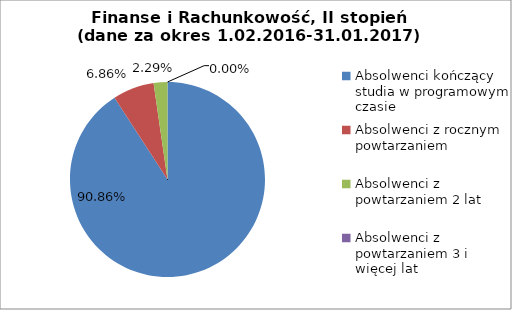
| Category | Series 0 |
|---|---|
| Absolwenci kończący studia w programowym czasie | 90.857 |
| Absolwenci z rocznym powtarzaniem | 6.857 |
| Absolwenci z powtarzaniem 2 lat | 2.286 |
| Absolwenci z powtarzaniem 3 i więcej lat | 0 |